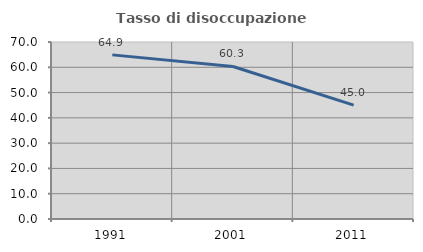
| Category | Tasso di disoccupazione giovanile  |
|---|---|
| 1991.0 | 64.907 |
| 2001.0 | 60.331 |
| 2011.0 | 45.045 |